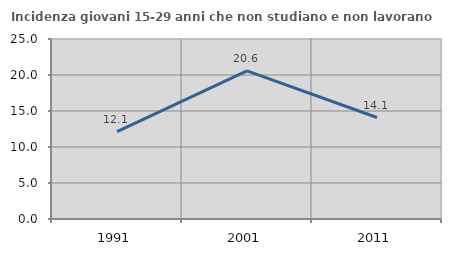
| Category | Incidenza giovani 15-29 anni che non studiano e non lavorano  |
|---|---|
| 1991.0 | 12.127 |
| 2001.0 | 20.567 |
| 2011.0 | 14.094 |